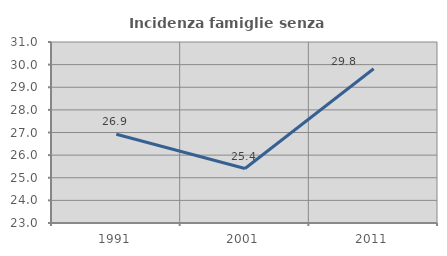
| Category | Incidenza famiglie senza nuclei |
|---|---|
| 1991.0 | 26.926 |
| 2001.0 | 25.407 |
| 2011.0 | 29.815 |